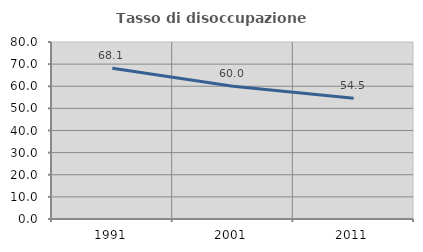
| Category | Tasso di disoccupazione giovanile  |
|---|---|
| 1991.0 | 68.116 |
| 2001.0 | 60 |
| 2011.0 | 54.545 |